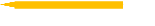
| Category | Helps in implementing change at the organization |
|---|---|
| Likely to face huge resistance | 4 |